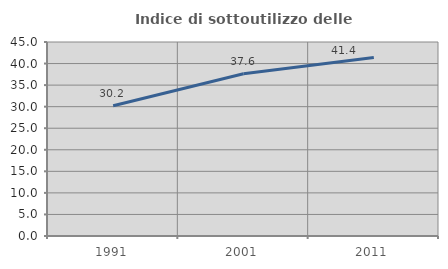
| Category | Indice di sottoutilizzo delle abitazioni  |
|---|---|
| 1991.0 | 30.218 |
| 2001.0 | 37.625 |
| 2011.0 | 41.415 |